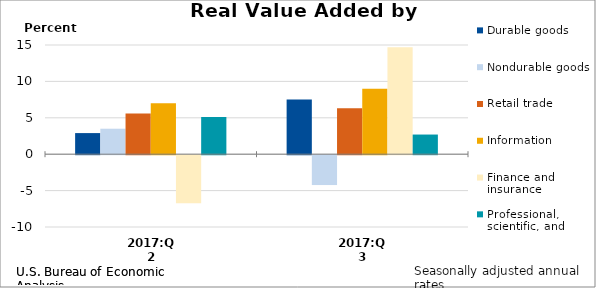
| Category | Durable goods | Nondurable goods | Retail trade | Information | Finance and insurance | Professional, scientific, and technical services |
|---|---|---|---|---|---|---|
| 2017:Q2 | 2.9 | 3.5 | 5.6 | 7 | -6.6 | 5.1 |
| 2017:Q3 | 7.5 | -4.1 | 6.3 | 9 | 14.7 | 2.7 |